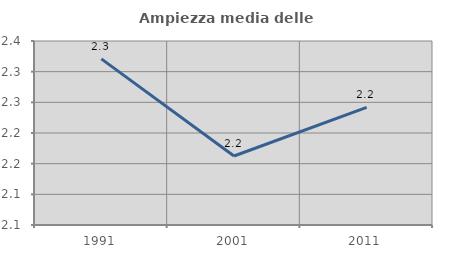
| Category | Ampiezza media delle famiglie |
|---|---|
| 1991.0 | 2.321 |
| 2001.0 | 2.162 |
| 2011.0 | 2.242 |